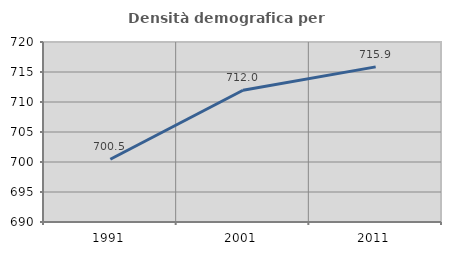
| Category | Densità demografica |
|---|---|
| 1991.0 | 700.457 |
| 2001.0 | 711.96 |
| 2011.0 | 715.853 |